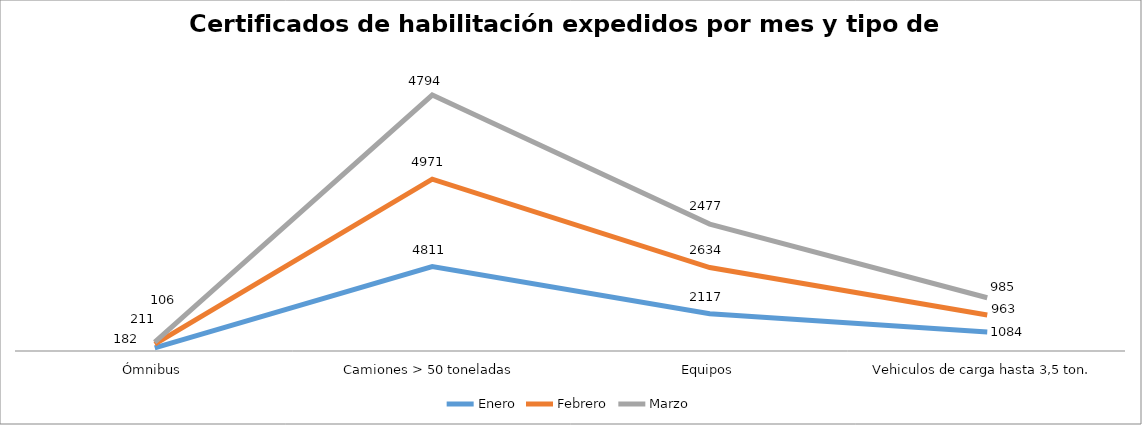
| Category | Enero | Febrero | Marzo |
|---|---|---|---|
| Ómnibus | 182 | 211 | 106 |
| Camiones > 50 toneladas | 4811 | 4971 | 4794 |
| Equipos | 2117 | 2634 | 2477 |
| Vehiculos de carga hasta 3,5 ton. | 1084 | 963 | 985 |